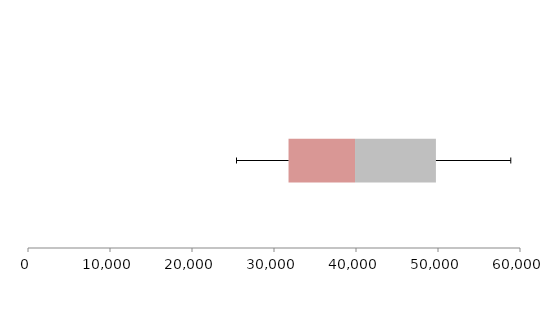
| Category | Series 1 | Series 2 | Series 3 |
|---|---|---|---|
| 0 | 31772.547 | 8107.698 | 9866.782 |